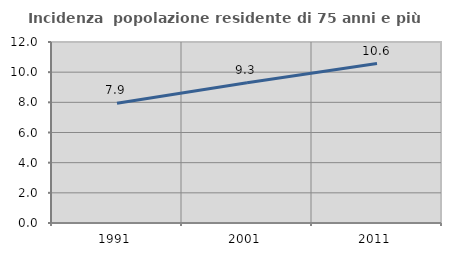
| Category | Incidenza  popolazione residente di 75 anni e più |
|---|---|
| 1991.0 | 7.933 |
| 2001.0 | 9.293 |
| 2011.0 | 10.572 |